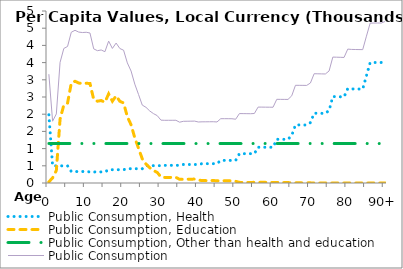
| Category | Public Consumption, Health | Public Consumption, Education | Public Consumption, Other than health and education | Public Consumption |
|---|---|---|---|---|
| 0 | 1983.373 | 32.135 | 1147.475 | 3162.983 |
|  | 498.661 | 150.104 | 1147.475 | 1796.239 |
| 2 | 498.634 | 361.746 | 1147.475 | 2007.855 |
| 3 | 498.577 | 1859.614 | 1147.475 | 3505.666 |
| 4 | 498.581 | 2264.527 | 1147.475 | 3910.583 |
| 5 | 498.595 | 2323.455 | 1147.475 | 3969.526 |
| 6 | 333.888 | 2901.037 | 1147.475 | 4382.4 |
| 7 | 333.89 | 2957.593 | 1147.475 | 4438.958 |
| 8 | 333.895 | 2905.583 | 1147.475 | 4386.953 |
| 9 | 333.887 | 2892.647 | 1147.475 | 4374.008 |
| 10 | 333.883 | 2900.059 | 1147.475 | 4381.417 |
| 11 | 321.68 | 2891.752 | 1147.475 | 4360.906 |
| 12 | 321.669 | 2430.068 | 1147.475 | 3899.212 |
| 13 | 321.664 | 2377.22 | 1147.475 | 3846.36 |
| 14 | 321.657 | 2397.726 | 1147.475 | 3866.858 |
| 15 | 321.644 | 2347.552 | 1147.475 | 3816.67 |
| 16 | 386.093 | 2590.651 | 1147.475 | 4124.219 |
| 17 | 386.094 | 2378.329 | 1147.475 | 3911.898 |
| 18 | 386.094 | 2534.379 | 1147.475 | 4067.948 |
| 19 | 386.104 | 2375.406 | 1147.475 | 3908.985 |
| 20 | 386.108 | 2326.464 | 1147.475 | 3860.047 |
| 21 | 414.923 | 1929.193 | 1147.475 | 3491.591 |
| 22 | 414.96 | 1692.531 | 1147.475 | 3254.965 |
| 23 | 414.996 | 1311.458 | 1147.475 | 2873.929 |
| 24 | 415.042 | 1009.749 | 1147.475 | 2572.266 |
| 25 | 415.077 | 702.067 | 1147.475 | 2264.618 |
| 26 | 503.65 | 548.62 | 1147.475 | 2199.745 |
| 27 | 503.754 | 442.269 | 1147.475 | 2093.497 |
| 28 | 503.879 | 365.385 | 1147.475 | 2016.739 |
| 29 | 503.997 | 307.248 | 1147.475 | 1958.72 |
| 30 | 504.258 | 175.202 | 1147.475 | 1826.935 |
| 31 | 512.308 | 162.606 | 1147.475 | 1822.388 |
| 32 | 512.589 | 163.03 | 1147.475 | 1823.094 |
| 33 | 512.892 | 162.85 | 1147.475 | 1823.217 |
| 34 | 513.11 | 162.935 | 1147.475 | 1823.52 |
| 35 | 513.341 | 106.596 | 1147.475 | 1767.413 |
| 36 | 537.915 | 108.134 | 1147.475 | 1793.523 |
| 37 | 538.043 | 109.612 | 1147.475 | 1795.129 |
| 38 | 538.15 | 111.467 | 1147.475 | 1797.092 |
| 39 | 538.286 | 113.511 | 1147.475 | 1799.272 |
| 40 | 538.397 | 87.446 | 1147.475 | 1773.317 |
| 41 | 561.878 | 69.039 | 1147.475 | 1778.392 |
| 42 | 561.895 | 69.652 | 1147.475 | 1779.022 |
| 43 | 561.925 | 70.686 | 1147.475 | 1780.086 |
| 44 | 561.946 | 71.688 | 1147.475 | 1781.108 |
| 45 | 561.94 | 64.921 | 1147.475 | 1774.335 |
| 46 | 656.689 | 65.219 | 1147.475 | 1869.383 |
| 47 | 656.688 | 65.392 | 1147.475 | 1869.555 |
| 48 | 656.701 | 64.943 | 1147.475 | 1869.118 |
| 49 | 656.74 | 63.622 | 1147.475 | 1867.837 |
| 50 | 656.789 | 49.489 | 1147.475 | 1853.752 |
| 51 | 852.338 | 18.427 | 1147.475 | 2018.24 |
| 52 | 852.301 | 17.02 | 1147.475 | 2016.796 |
| 53 | 852.268 | 15.632 | 1147.475 | 2015.375 |
| 54 | 852.243 | 14.463 | 1147.475 | 2014.18 |
| 55 | 852.219 | 20.965 | 1147.475 | 2020.658 |
| 56 | 1039.327 | 20.165 | 1147.475 | 2206.967 |
| 57 | 1039.223 | 19.077 | 1147.475 | 2205.775 |
| 58 | 1039.033 | 18.203 | 1147.475 | 2204.711 |
| 59 | 1038.736 | 17.602 | 1147.475 | 2203.812 |
| 60 | 1038.375 | 16.213 | 1147.475 | 2202.063 |
| 61 | 1270.85 | 14.04 | 1147.475 | 2432.365 |
| 62 | 1269.935 | 13.902 | 1147.475 | 2431.312 |
| 63 | 1269.419 | 13.587 | 1147.475 | 2430.481 |
| 64 | 1269.024 | 12.909 | 1147.475 | 2429.408 |
| 65 | 1382.911 | 3.75 | 1147.475 | 2534.135 |
| 66 | 1688.616 | 3.745 | 1147.475 | 2839.836 |
| 67 | 1687.864 | 3.784 | 1147.475 | 2839.122 |
| 68 | 1686.755 | 3.834 | 1147.475 | 2838.063 |
| 69 | 1685.537 | 3.926 | 1147.475 | 2836.938 |
| 70 | 1755.301 | 4.066 | 1147.475 | 2906.842 |
| 71 | 2028.924 | 0 | 1147.475 | 3176.399 |
| 72 | 2026.654 | 0 | 1147.475 | 3174.128 |
| 73 | 2024.321 | 0 | 1147.475 | 3171.796 |
| 74 | 2021.883 | 0 | 1147.475 | 3169.358 |
| 75 | 2109.504 | 0 | 1147.475 | 3256.979 |
| 76 | 2512.612 | 0 | 1147.475 | 3660.086 |
| 77 | 2509.69 | 0 | 1147.475 | 3657.165 |
| 78 | 2506.288 | 0 | 1147.475 | 3653.763 |
| 79 | 2502.261 | 0 | 1147.475 | 3649.736 |
| 80 | 2745.311 | 0 | 1147.475 | 3892.786 |
| 81 | 2735.465 | 0 | 1147.475 | 3882.94 |
| 82 | 2733.185 | 0 | 1147.475 | 3880.66 |
| 83 | 2731.377 | 0 | 1147.475 | 3878.851 |
| 84 | 2729.82 | 0 | 1147.475 | 3877.295 |
| 85 | 3120.936 | 0 | 1147.475 | 4268.411 |
| 86 | 3501.333 | 0 | 1147.475 | 4648.808 |
| 87 | 3502.107 | 0 | 1147.475 | 4649.582 |
| 88 | 3502.85 | 0 | 1147.475 | 4650.324 |
| 89 | 3503.58 | 0 | 1147.475 | 4651.055 |
| 90+ | 3549.921 | 0 | 1147.475 | 4697.395 |